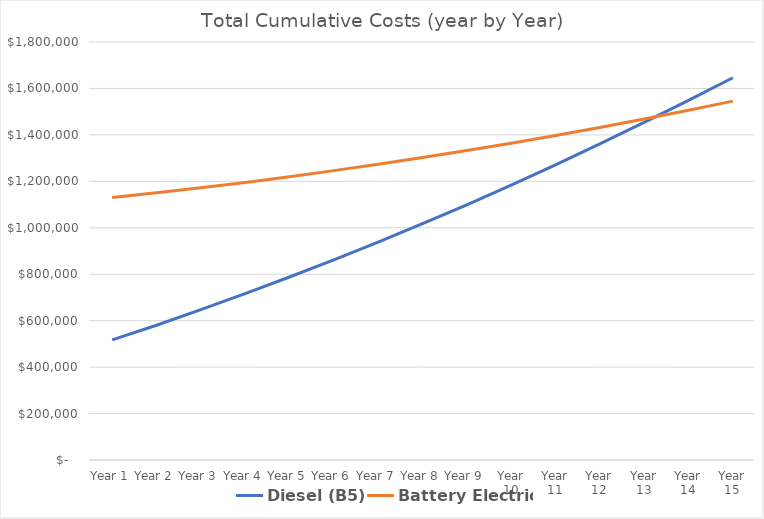
| Category | Diesel (B5) | Battery Electric |
|---|---|---|
| Year 1 | 517174.109 | 1130542.408 |
| Year 2 | 580397.536 | 1150915.394 |
| Year 3 | 647202.134 | 1172465.47 |
| Year 4 | 716437.343 | 1195335.697 |
| Year 5 | 788018.311 | 1220014.963 |
| Year 6 | 862013.889 | 1246063.59 |
| Year 7 | 938485.74 | 1273477.273 |
| Year 8 | 1017537.196 | 1302299.421 |
| Year 9 | 1098993.778 | 1332589.375 |
| Year 10 | 1183815.701 | 1364265.723 |
| Year 11 | 1271204.922 | 1397465.863 |
| Year 12 | 1361277.607 | 1432121.145 |
| Year 13 | 1453772.643 | 1468385.498 |
| Year 14 | 1548652.355 | 1506190.54 |
| Year 15 | 1646011.987 | 1545469.373 |